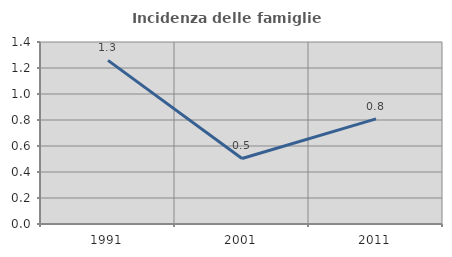
| Category | Incidenza delle famiglie numerose |
|---|---|
| 1991.0 | 1.259 |
| 2001.0 | 0.504 |
| 2011.0 | 0.808 |